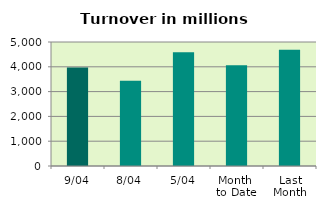
| Category | Series 0 |
|---|---|
| 9/04 | 3969.144 |
| 8/04 | 3437.172 |
| 5/04 | 4585.48 |
| Month 
to Date | 4063.704 |
| Last
Month | 4683.179 |